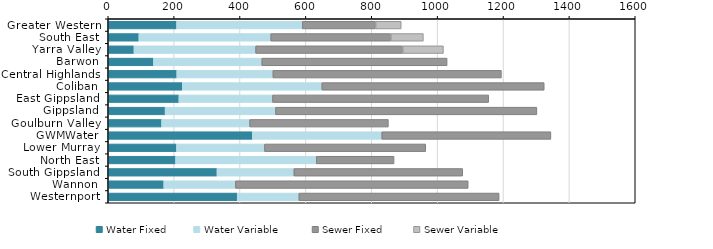
| Category | Water Fixed | Water Variable   | Sewer Fixed  | Sewer Variable   |
|---|---|---|---|---|
| Greater Western | 207.58 | 381.539 | 222.59 | 77.819 |
| South East | 93.13 | 400.296 | 364.48 | 98.864 |
| Yarra Valley | 78.19 | 369.267 | 446.59 | 123.647 |
| Barwon | 137.35 | 328.963 | 562.53 | 0 |
| Central Highlands | 208.17 | 291.783 | 693.76 | 0 |
| Coliban | 224.69 | 423.818 | 675.23 | 0 |
| East Gippsland | 214.61 | 284.161 | 656.27 | 0 |
| Gippsland | 172.72 | 335.179 | 793.52 | 0 |
| Goulburn Valley | 162.12 | 267.339 | 421.08 | 0 |
| GWMWater | 437.71 | 392.807 | 513.45 | 0 |
| Lower Murray | 207.36 | 266.984 | 489.54 | 0 |
| North East | 204.52 | 427.133 | 236.16 | 0 |
| South Gippsland | 330.19 | 233.462 | 512.44 | 0 |
| Wannon | 168.73 | 217.403 | 706.75 | 0 |
| Westernport | 391.6 | 187.239 | 607.94 | 0 |